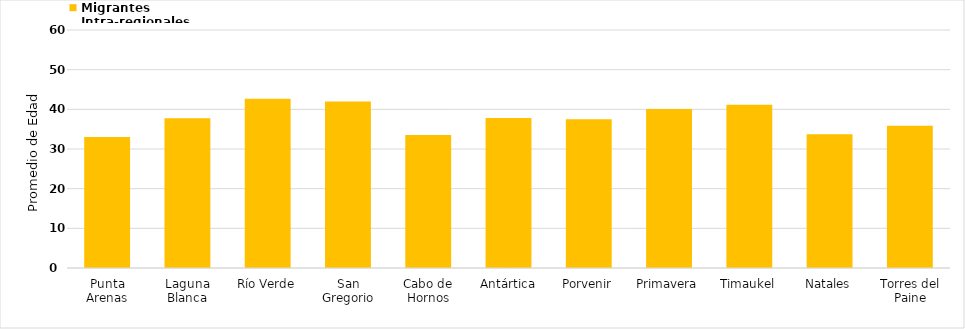
| Category | Migrantes Intra-regionales |
|---|---|
| Punta Arenas | 33.012 |
| Laguna Blanca | 37.783 |
| Río Verde | 42.679 |
| San Gregorio | 41.952 |
| Cabo de Hornos | 33.534 |
| Antártica | 37.833 |
| Porvenir | 37.47 |
| Primavera | 40.103 |
| Timaukel | 41.147 |
| Natales | 33.702 |
| Torres del Paine | 35.87 |